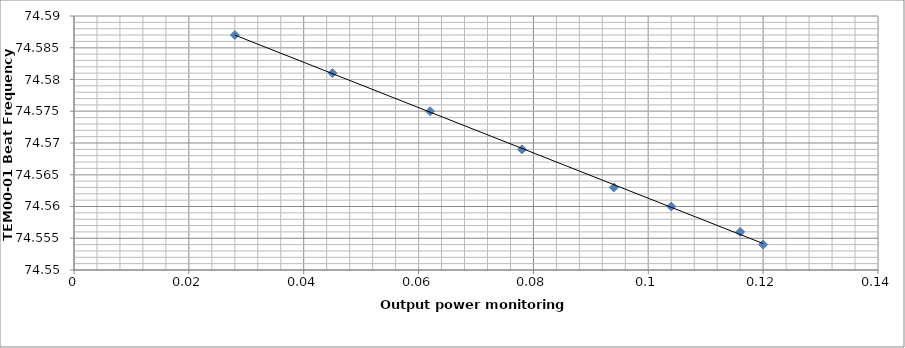
| Category | Series 0 |
|---|---|
| 0.12 | 74.554 |
| 0.116 | 74.556 |
| 0.104 | 74.56 |
| 0.094 | 74.563 |
| 0.078 | 74.569 |
| 0.062 | 74.575 |
| 0.045 | 74.581 |
| 0.028 | 74.587 |